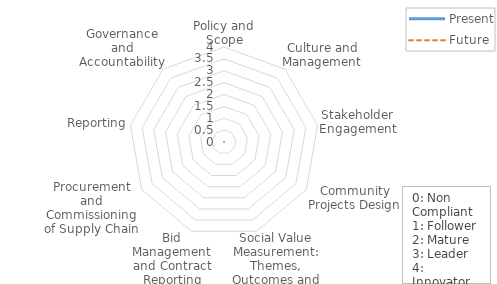
| Category | Present | Future |
|---|---|---|
| Policy and Scope | 0 | 0 |
| Culture and Management | 0 | 0 |
| Stakeholder Engagement | 0 | 0 |
| Community Projects Design | 0 | 0 |
| Social Value Measurement: Themes, Outcomes and Measures | 0 | 0 |
| Bid Management and Contract Reporting | 0 | 0 |
| Procurement and Commissioning of Supply Chain | 0 | 0 |
| Reporting | 0 | 0 |
| Governance and Accountability | 0 | 0 |